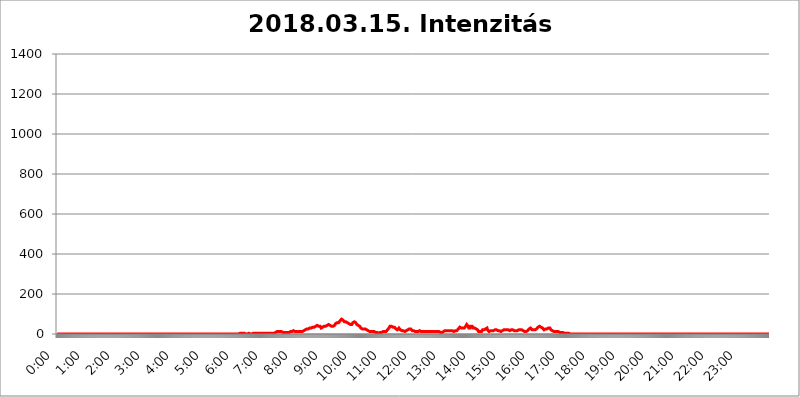
| Category | 2018.03.15. Intenzitás [W/m^2] |
|---|---|
| 0.0 | 0 |
| 0.0006944444444444445 | 0 |
| 0.001388888888888889 | 0 |
| 0.0020833333333333333 | 0 |
| 0.002777777777777778 | 0 |
| 0.003472222222222222 | 0 |
| 0.004166666666666667 | 0 |
| 0.004861111111111111 | 0 |
| 0.005555555555555556 | 0 |
| 0.0062499999999999995 | 0 |
| 0.006944444444444444 | 0 |
| 0.007638888888888889 | 0 |
| 0.008333333333333333 | 0 |
| 0.009027777777777779 | 0 |
| 0.009722222222222222 | 0 |
| 0.010416666666666666 | 0 |
| 0.011111111111111112 | 0 |
| 0.011805555555555555 | 0 |
| 0.012499999999999999 | 0 |
| 0.013194444444444444 | 0 |
| 0.013888888888888888 | 0 |
| 0.014583333333333332 | 0 |
| 0.015277777777777777 | 0 |
| 0.015972222222222224 | 0 |
| 0.016666666666666666 | 0 |
| 0.017361111111111112 | 0 |
| 0.018055555555555557 | 0 |
| 0.01875 | 0 |
| 0.019444444444444445 | 0 |
| 0.02013888888888889 | 0 |
| 0.020833333333333332 | 0 |
| 0.02152777777777778 | 0 |
| 0.022222222222222223 | 0 |
| 0.02291666666666667 | 0 |
| 0.02361111111111111 | 0 |
| 0.024305555555555556 | 0 |
| 0.024999999999999998 | 0 |
| 0.025694444444444447 | 0 |
| 0.02638888888888889 | 0 |
| 0.027083333333333334 | 0 |
| 0.027777777777777776 | 0 |
| 0.02847222222222222 | 0 |
| 0.029166666666666664 | 0 |
| 0.029861111111111113 | 0 |
| 0.030555555555555555 | 0 |
| 0.03125 | 0 |
| 0.03194444444444445 | 0 |
| 0.03263888888888889 | 0 |
| 0.03333333333333333 | 0 |
| 0.034027777777777775 | 0 |
| 0.034722222222222224 | 0 |
| 0.035416666666666666 | 0 |
| 0.036111111111111115 | 0 |
| 0.03680555555555556 | 0 |
| 0.0375 | 0 |
| 0.03819444444444444 | 0 |
| 0.03888888888888889 | 0 |
| 0.03958333333333333 | 0 |
| 0.04027777777777778 | 0 |
| 0.04097222222222222 | 0 |
| 0.041666666666666664 | 0 |
| 0.042361111111111106 | 0 |
| 0.04305555555555556 | 0 |
| 0.043750000000000004 | 0 |
| 0.044444444444444446 | 0 |
| 0.04513888888888889 | 0 |
| 0.04583333333333334 | 0 |
| 0.04652777777777778 | 0 |
| 0.04722222222222222 | 0 |
| 0.04791666666666666 | 0 |
| 0.04861111111111111 | 0 |
| 0.049305555555555554 | 0 |
| 0.049999999999999996 | 0 |
| 0.05069444444444445 | 0 |
| 0.051388888888888894 | 0 |
| 0.052083333333333336 | 0 |
| 0.05277777777777778 | 0 |
| 0.05347222222222222 | 0 |
| 0.05416666666666667 | 0 |
| 0.05486111111111111 | 0 |
| 0.05555555555555555 | 0 |
| 0.05625 | 0 |
| 0.05694444444444444 | 0 |
| 0.057638888888888885 | 0 |
| 0.05833333333333333 | 0 |
| 0.05902777777777778 | 0 |
| 0.059722222222222225 | 0 |
| 0.06041666666666667 | 0 |
| 0.061111111111111116 | 0 |
| 0.06180555555555556 | 0 |
| 0.0625 | 0 |
| 0.06319444444444444 | 0 |
| 0.06388888888888888 | 0 |
| 0.06458333333333334 | 0 |
| 0.06527777777777778 | 0 |
| 0.06597222222222222 | 0 |
| 0.06666666666666667 | 0 |
| 0.06736111111111111 | 0 |
| 0.06805555555555555 | 0 |
| 0.06874999999999999 | 0 |
| 0.06944444444444443 | 0 |
| 0.07013888888888889 | 0 |
| 0.07083333333333333 | 0 |
| 0.07152777777777779 | 0 |
| 0.07222222222222223 | 0 |
| 0.07291666666666667 | 0 |
| 0.07361111111111111 | 0 |
| 0.07430555555555556 | 0 |
| 0.075 | 0 |
| 0.07569444444444444 | 0 |
| 0.0763888888888889 | 0 |
| 0.07708333333333334 | 0 |
| 0.07777777777777778 | 0 |
| 0.07847222222222222 | 0 |
| 0.07916666666666666 | 0 |
| 0.0798611111111111 | 0 |
| 0.08055555555555556 | 0 |
| 0.08125 | 0 |
| 0.08194444444444444 | 0 |
| 0.08263888888888889 | 0 |
| 0.08333333333333333 | 0 |
| 0.08402777777777777 | 0 |
| 0.08472222222222221 | 0 |
| 0.08541666666666665 | 0 |
| 0.08611111111111112 | 0 |
| 0.08680555555555557 | 0 |
| 0.08750000000000001 | 0 |
| 0.08819444444444445 | 0 |
| 0.08888888888888889 | 0 |
| 0.08958333333333333 | 0 |
| 0.09027777777777778 | 0 |
| 0.09097222222222222 | 0 |
| 0.09166666666666667 | 0 |
| 0.09236111111111112 | 0 |
| 0.09305555555555556 | 0 |
| 0.09375 | 0 |
| 0.09444444444444444 | 0 |
| 0.09513888888888888 | 0 |
| 0.09583333333333333 | 0 |
| 0.09652777777777777 | 0 |
| 0.09722222222222222 | 0 |
| 0.09791666666666667 | 0 |
| 0.09861111111111111 | 0 |
| 0.09930555555555555 | 0 |
| 0.09999999999999999 | 0 |
| 0.10069444444444443 | 0 |
| 0.1013888888888889 | 0 |
| 0.10208333333333335 | 0 |
| 0.10277777777777779 | 0 |
| 0.10347222222222223 | 0 |
| 0.10416666666666667 | 0 |
| 0.10486111111111111 | 0 |
| 0.10555555555555556 | 0 |
| 0.10625 | 0 |
| 0.10694444444444444 | 0 |
| 0.1076388888888889 | 0 |
| 0.10833333333333334 | 0 |
| 0.10902777777777778 | 0 |
| 0.10972222222222222 | 0 |
| 0.1111111111111111 | 0 |
| 0.11180555555555556 | 0 |
| 0.11180555555555556 | 0 |
| 0.1125 | 0 |
| 0.11319444444444444 | 0 |
| 0.11388888888888889 | 0 |
| 0.11458333333333333 | 0 |
| 0.11527777777777777 | 0 |
| 0.11597222222222221 | 0 |
| 0.11666666666666665 | 0 |
| 0.1173611111111111 | 0 |
| 0.11805555555555557 | 0 |
| 0.11944444444444445 | 0 |
| 0.12013888888888889 | 0 |
| 0.12083333333333333 | 0 |
| 0.12152777777777778 | 0 |
| 0.12222222222222223 | 0 |
| 0.12291666666666667 | 0 |
| 0.12291666666666667 | 0 |
| 0.12361111111111112 | 0 |
| 0.12430555555555556 | 0 |
| 0.125 | 0 |
| 0.12569444444444444 | 0 |
| 0.12638888888888888 | 0 |
| 0.12708333333333333 | 0 |
| 0.16875 | 0 |
| 0.12847222222222224 | 0 |
| 0.12916666666666668 | 0 |
| 0.12986111111111112 | 0 |
| 0.13055555555555556 | 0 |
| 0.13125 | 0 |
| 0.13194444444444445 | 0 |
| 0.1326388888888889 | 0 |
| 0.13333333333333333 | 0 |
| 0.13402777777777777 | 0 |
| 0.13402777777777777 | 0 |
| 0.13472222222222222 | 0 |
| 0.13541666666666666 | 0 |
| 0.1361111111111111 | 0 |
| 0.13749999999999998 | 0 |
| 0.13819444444444443 | 0 |
| 0.1388888888888889 | 0 |
| 0.13958333333333334 | 0 |
| 0.14027777777777778 | 0 |
| 0.14097222222222222 | 0 |
| 0.14166666666666666 | 0 |
| 0.1423611111111111 | 0 |
| 0.14305555555555557 | 0 |
| 0.14375000000000002 | 0 |
| 0.14444444444444446 | 0 |
| 0.1451388888888889 | 0 |
| 0.1451388888888889 | 0 |
| 0.14652777777777778 | 0 |
| 0.14722222222222223 | 0 |
| 0.14791666666666667 | 0 |
| 0.1486111111111111 | 0 |
| 0.14930555555555555 | 0 |
| 0.15 | 0 |
| 0.15069444444444444 | 0 |
| 0.15138888888888888 | 0 |
| 0.15208333333333332 | 0 |
| 0.15277777777777776 | 0 |
| 0.15347222222222223 | 0 |
| 0.15416666666666667 | 0 |
| 0.15486111111111112 | 0 |
| 0.15555555555555556 | 0 |
| 0.15625 | 0 |
| 0.15694444444444444 | 0 |
| 0.15763888888888888 | 0 |
| 0.15833333333333333 | 0 |
| 0.15902777777777777 | 0 |
| 0.15972222222222224 | 0 |
| 0.16041666666666668 | 0 |
| 0.16111111111111112 | 0 |
| 0.16180555555555556 | 0 |
| 0.1625 | 0 |
| 0.16319444444444445 | 0 |
| 0.1638888888888889 | 0 |
| 0.16458333333333333 | 0 |
| 0.16527777777777777 | 0 |
| 0.16597222222222222 | 0 |
| 0.16666666666666666 | 0 |
| 0.1673611111111111 | 0 |
| 0.16805555555555554 | 0 |
| 0.16874999999999998 | 0 |
| 0.16944444444444443 | 0 |
| 0.17013888888888887 | 0 |
| 0.1708333333333333 | 0 |
| 0.17152777777777775 | 0 |
| 0.17222222222222225 | 0 |
| 0.1729166666666667 | 0 |
| 0.17361111111111113 | 0 |
| 0.17430555555555557 | 0 |
| 0.17500000000000002 | 0 |
| 0.17569444444444446 | 0 |
| 0.1763888888888889 | 0 |
| 0.17708333333333334 | 0 |
| 0.17777777777777778 | 0 |
| 0.17847222222222223 | 0 |
| 0.17916666666666667 | 0 |
| 0.1798611111111111 | 0 |
| 0.18055555555555555 | 0 |
| 0.18125 | 0 |
| 0.18194444444444444 | 0 |
| 0.1826388888888889 | 0 |
| 0.18333333333333335 | 0 |
| 0.1840277777777778 | 0 |
| 0.18472222222222223 | 0 |
| 0.18541666666666667 | 0 |
| 0.18611111111111112 | 0 |
| 0.18680555555555556 | 0 |
| 0.1875 | 0 |
| 0.18819444444444444 | 0 |
| 0.18888888888888888 | 0 |
| 0.18958333333333333 | 0 |
| 0.19027777777777777 | 0 |
| 0.1909722222222222 | 0 |
| 0.19166666666666665 | 0 |
| 0.19236111111111112 | 0 |
| 0.19305555555555554 | 0 |
| 0.19375 | 0 |
| 0.19444444444444445 | 0 |
| 0.1951388888888889 | 0 |
| 0.19583333333333333 | 0 |
| 0.19652777777777777 | 0 |
| 0.19722222222222222 | 0 |
| 0.19791666666666666 | 0 |
| 0.1986111111111111 | 0 |
| 0.19930555555555554 | 0 |
| 0.19999999999999998 | 0 |
| 0.20069444444444443 | 0 |
| 0.20138888888888887 | 0 |
| 0.2020833333333333 | 0 |
| 0.2027777777777778 | 0 |
| 0.2034722222222222 | 0 |
| 0.2041666666666667 | 0 |
| 0.20486111111111113 | 0 |
| 0.20555555555555557 | 0 |
| 0.20625000000000002 | 0 |
| 0.20694444444444446 | 0 |
| 0.2076388888888889 | 0 |
| 0.20833333333333334 | 0 |
| 0.20902777777777778 | 0 |
| 0.20972222222222223 | 0 |
| 0.21041666666666667 | 0 |
| 0.2111111111111111 | 0 |
| 0.21180555555555555 | 0 |
| 0.2125 | 0 |
| 0.21319444444444444 | 0 |
| 0.2138888888888889 | 0 |
| 0.21458333333333335 | 0 |
| 0.2152777777777778 | 0 |
| 0.21597222222222223 | 0 |
| 0.21666666666666667 | 0 |
| 0.21736111111111112 | 0 |
| 0.21805555555555556 | 0 |
| 0.21875 | 0 |
| 0.21944444444444444 | 0 |
| 0.22013888888888888 | 0 |
| 0.22083333333333333 | 0 |
| 0.22152777777777777 | 0 |
| 0.2222222222222222 | 0 |
| 0.22291666666666665 | 0 |
| 0.2236111111111111 | 0 |
| 0.22430555555555556 | 0 |
| 0.225 | 0 |
| 0.22569444444444445 | 0 |
| 0.2263888888888889 | 0 |
| 0.22708333333333333 | 0 |
| 0.22777777777777777 | 0 |
| 0.22847222222222222 | 0 |
| 0.22916666666666666 | 0 |
| 0.2298611111111111 | 0 |
| 0.23055555555555554 | 0 |
| 0.23124999999999998 | 0 |
| 0.23194444444444443 | 0 |
| 0.23263888888888887 | 0 |
| 0.2333333333333333 | 0 |
| 0.2340277777777778 | 0 |
| 0.2347222222222222 | 0 |
| 0.2354166666666667 | 0 |
| 0.23611111111111113 | 0 |
| 0.23680555555555557 | 0 |
| 0.23750000000000002 | 0 |
| 0.23819444444444446 | 0 |
| 0.2388888888888889 | 0 |
| 0.23958333333333334 | 0 |
| 0.24027777777777778 | 0 |
| 0.24097222222222223 | 0 |
| 0.24166666666666667 | 0 |
| 0.2423611111111111 | 0 |
| 0.24305555555555555 | 0 |
| 0.24375 | 0 |
| 0.24444444444444446 | 0 |
| 0.24513888888888888 | 0 |
| 0.24583333333333335 | 0 |
| 0.2465277777777778 | 0 |
| 0.24722222222222223 | 0 |
| 0.24791666666666667 | 0 |
| 0.24861111111111112 | 0 |
| 0.24930555555555556 | 0 |
| 0.25 | 0 |
| 0.25069444444444444 | 0 |
| 0.2513888888888889 | 0 |
| 0.2520833333333333 | 0 |
| 0.25277777777777777 | 0 |
| 0.2534722222222222 | 0 |
| 0.25416666666666665 | 0 |
| 0.2548611111111111 | 0 |
| 0.2555555555555556 | 0 |
| 0.25625000000000003 | 3.525 |
| 0.2569444444444445 | 3.525 |
| 0.2576388888888889 | 3.525 |
| 0.25833333333333336 | 3.525 |
| 0.2590277777777778 | 3.525 |
| 0.25972222222222224 | 3.525 |
| 0.2604166666666667 | 3.525 |
| 0.2611111111111111 | 3.525 |
| 0.26180555555555557 | 3.525 |
| 0.2625 | 3.525 |
| 0.26319444444444445 | 3.525 |
| 0.2638888888888889 | 3.525 |
| 0.26458333333333334 | 0 |
| 0.2652777777777778 | 0 |
| 0.2659722222222222 | 0 |
| 0.26666666666666666 | 0 |
| 0.2673611111111111 | 0 |
| 0.26805555555555555 | 0 |
| 0.26875 | 3.525 |
| 0.26944444444444443 | 0 |
| 0.2701388888888889 | 3.525 |
| 0.2708333333333333 | 0 |
| 0.27152777777777776 | 3.525 |
| 0.2722222222222222 | 3.525 |
| 0.27291666666666664 | 0 |
| 0.2736111111111111 | 0 |
| 0.2743055555555555 | 3.525 |
| 0.27499999999999997 | 3.525 |
| 0.27569444444444446 | 0 |
| 0.27638888888888885 | 0 |
| 0.27708333333333335 | 3.525 |
| 0.2777777777777778 | 0 |
| 0.27847222222222223 | 3.525 |
| 0.2791666666666667 | 3.525 |
| 0.2798611111111111 | 3.525 |
| 0.28055555555555556 | 3.525 |
| 0.28125 | 3.525 |
| 0.28194444444444444 | 3.525 |
| 0.2826388888888889 | 3.525 |
| 0.2833333333333333 | 3.525 |
| 0.28402777777777777 | 3.525 |
| 0.2847222222222222 | 3.525 |
| 0.28541666666666665 | 3.525 |
| 0.28611111111111115 | 3.525 |
| 0.28680555555555554 | 0 |
| 0.28750000000000003 | 3.525 |
| 0.2881944444444445 | 3.525 |
| 0.2888888888888889 | 3.525 |
| 0.28958333333333336 | 3.525 |
| 0.2902777777777778 | 3.525 |
| 0.29097222222222224 | 3.525 |
| 0.2916666666666667 | 3.525 |
| 0.2923611111111111 | 3.525 |
| 0.29305555555555557 | 3.525 |
| 0.29375 | 3.525 |
| 0.29444444444444445 | 3.525 |
| 0.2951388888888889 | 3.525 |
| 0.29583333333333334 | 3.525 |
| 0.2965277777777778 | 3.525 |
| 0.2972222222222222 | 3.525 |
| 0.29791666666666666 | 3.525 |
| 0.2986111111111111 | 3.525 |
| 0.29930555555555555 | 3.525 |
| 0.3 | 3.525 |
| 0.30069444444444443 | 3.525 |
| 0.3013888888888889 | 3.525 |
| 0.3020833333333333 | 3.525 |
| 0.30277777777777776 | 3.525 |
| 0.3034722222222222 | 3.525 |
| 0.30416666666666664 | 3.525 |
| 0.3048611111111111 | 7.887 |
| 0.3055555555555555 | 7.887 |
| 0.30624999999999997 | 7.887 |
| 0.3069444444444444 | 7.887 |
| 0.3076388888888889 | 7.887 |
| 0.30833333333333335 | 12.257 |
| 0.3090277777777778 | 12.257 |
| 0.30972222222222223 | 12.257 |
| 0.3104166666666667 | 12.257 |
| 0.3111111111111111 | 12.257 |
| 0.31180555555555556 | 12.257 |
| 0.3125 | 12.257 |
| 0.31319444444444444 | 12.257 |
| 0.3138888888888889 | 12.257 |
| 0.3145833333333333 | 12.257 |
| 0.31527777777777777 | 12.257 |
| 0.3159722222222222 | 7.887 |
| 0.31666666666666665 | 7.887 |
| 0.31736111111111115 | 7.887 |
| 0.31805555555555554 | 7.887 |
| 0.31875000000000003 | 7.887 |
| 0.3194444444444445 | 7.887 |
| 0.3201388888888889 | 7.887 |
| 0.32083333333333336 | 7.887 |
| 0.3215277777777778 | 7.887 |
| 0.32222222222222224 | 7.887 |
| 0.3229166666666667 | 7.887 |
| 0.3236111111111111 | 7.887 |
| 0.32430555555555557 | 7.887 |
| 0.325 | 7.887 |
| 0.32569444444444445 | 7.887 |
| 0.3263888888888889 | 7.887 |
| 0.32708333333333334 | 12.257 |
| 0.3277777777777778 | 12.257 |
| 0.3284722222222222 | 12.257 |
| 0.32916666666666666 | 12.257 |
| 0.3298611111111111 | 12.257 |
| 0.33055555555555555 | 12.257 |
| 0.33125 | 16.636 |
| 0.33194444444444443 | 16.636 |
| 0.3326388888888889 | 12.257 |
| 0.3333333333333333 | 12.257 |
| 0.3340277777777778 | 12.257 |
| 0.3347222222222222 | 12.257 |
| 0.3354166666666667 | 12.257 |
| 0.3361111111111111 | 12.257 |
| 0.3368055555555556 | 12.257 |
| 0.33749999999999997 | 12.257 |
| 0.33819444444444446 | 12.257 |
| 0.33888888888888885 | 12.257 |
| 0.33958333333333335 | 12.257 |
| 0.34027777777777773 | 12.257 |
| 0.34097222222222223 | 12.257 |
| 0.3416666666666666 | 12.257 |
| 0.3423611111111111 | 12.257 |
| 0.3430555555555555 | 12.257 |
| 0.34375 | 12.257 |
| 0.3444444444444445 | 12.257 |
| 0.3451388888888889 | 12.257 |
| 0.3458333333333334 | 16.636 |
| 0.34652777777777777 | 16.636 |
| 0.34722222222222227 | 21.024 |
| 0.34791666666666665 | 21.024 |
| 0.34861111111111115 | 25.419 |
| 0.34930555555555554 | 25.419 |
| 0.35000000000000003 | 25.419 |
| 0.3506944444444444 | 25.419 |
| 0.3513888888888889 | 25.419 |
| 0.3520833333333333 | 25.419 |
| 0.3527777777777778 | 25.419 |
| 0.3534722222222222 | 29.823 |
| 0.3541666666666667 | 29.823 |
| 0.3548611111111111 | 29.823 |
| 0.35555555555555557 | 29.823 |
| 0.35625 | 29.823 |
| 0.35694444444444445 | 34.234 |
| 0.3576388888888889 | 34.234 |
| 0.35833333333333334 | 34.234 |
| 0.3590277777777778 | 34.234 |
| 0.3597222222222222 | 34.234 |
| 0.36041666666666666 | 34.234 |
| 0.3611111111111111 | 34.234 |
| 0.36180555555555555 | 34.234 |
| 0.3625 | 38.653 |
| 0.36319444444444443 | 38.653 |
| 0.3638888888888889 | 38.653 |
| 0.3645833333333333 | 43.079 |
| 0.3652777777777778 | 38.653 |
| 0.3659722222222222 | 38.653 |
| 0.3666666666666667 | 38.653 |
| 0.3673611111111111 | 38.653 |
| 0.3680555555555556 | 38.653 |
| 0.36874999999999997 | 38.653 |
| 0.36944444444444446 | 34.234 |
| 0.37013888888888885 | 29.823 |
| 0.37083333333333335 | 34.234 |
| 0.37152777777777773 | 34.234 |
| 0.37222222222222223 | 34.234 |
| 0.3729166666666666 | 34.234 |
| 0.3736111111111111 | 34.234 |
| 0.3743055555555555 | 38.653 |
| 0.375 | 38.653 |
| 0.3756944444444445 | 38.653 |
| 0.3763888888888889 | 38.653 |
| 0.3770833333333334 | 43.079 |
| 0.37777777777777777 | 43.079 |
| 0.37847222222222227 | 43.079 |
| 0.37916666666666665 | 47.511 |
| 0.37986111111111115 | 47.511 |
| 0.38055555555555554 | 47.511 |
| 0.38125000000000003 | 43.079 |
| 0.3819444444444444 | 43.079 |
| 0.3826388888888889 | 43.079 |
| 0.3833333333333333 | 43.079 |
| 0.3840277777777778 | 38.653 |
| 0.3847222222222222 | 38.653 |
| 0.3854166666666667 | 38.653 |
| 0.3861111111111111 | 38.653 |
| 0.38680555555555557 | 38.653 |
| 0.3875 | 38.653 |
| 0.38819444444444445 | 43.079 |
| 0.3888888888888889 | 43.079 |
| 0.38958333333333334 | 47.511 |
| 0.3902777777777778 | 51.951 |
| 0.3909722222222222 | 51.951 |
| 0.39166666666666666 | 56.398 |
| 0.3923611111111111 | 56.398 |
| 0.39305555555555555 | 56.398 |
| 0.39375 | 51.951 |
| 0.39444444444444443 | 56.398 |
| 0.3951388888888889 | 56.398 |
| 0.3958333333333333 | 60.85 |
| 0.3965277777777778 | 65.31 |
| 0.3972222222222222 | 69.775 |
| 0.3979166666666667 | 69.775 |
| 0.3986111111111111 | 74.246 |
| 0.3993055555555556 | 69.775 |
| 0.39999999999999997 | 69.775 |
| 0.40069444444444446 | 69.775 |
| 0.40138888888888885 | 65.31 |
| 0.40208333333333335 | 65.31 |
| 0.40277777777777773 | 60.85 |
| 0.40347222222222223 | 60.85 |
| 0.4041666666666666 | 60.85 |
| 0.4048611111111111 | 60.85 |
| 0.4055555555555555 | 60.85 |
| 0.40625 | 56.398 |
| 0.4069444444444445 | 56.398 |
| 0.4076388888888889 | 56.398 |
| 0.4083333333333334 | 51.951 |
| 0.40902777777777777 | 51.951 |
| 0.40972222222222227 | 47.511 |
| 0.41041666666666665 | 47.511 |
| 0.41111111111111115 | 47.511 |
| 0.41180555555555554 | 47.511 |
| 0.41250000000000003 | 47.511 |
| 0.4131944444444444 | 47.511 |
| 0.4138888888888889 | 51.951 |
| 0.4145833333333333 | 56.398 |
| 0.4152777777777778 | 56.398 |
| 0.4159722222222222 | 56.398 |
| 0.4166666666666667 | 60.85 |
| 0.4173611111111111 | 65.31 |
| 0.41805555555555557 | 60.85 |
| 0.41875 | 56.398 |
| 0.41944444444444445 | 51.951 |
| 0.4201388888888889 | 47.511 |
| 0.42083333333333334 | 47.511 |
| 0.4215277777777778 | 43.079 |
| 0.4222222222222222 | 43.079 |
| 0.42291666666666666 | 43.079 |
| 0.4236111111111111 | 38.653 |
| 0.42430555555555555 | 38.653 |
| 0.425 | 34.234 |
| 0.42569444444444443 | 29.823 |
| 0.4263888888888889 | 29.823 |
| 0.4270833333333333 | 25.419 |
| 0.4277777777777778 | 25.419 |
| 0.4284722222222222 | 25.419 |
| 0.4291666666666667 | 25.419 |
| 0.4298611111111111 | 25.419 |
| 0.4305555555555556 | 25.419 |
| 0.43124999999999997 | 25.419 |
| 0.43194444444444446 | 25.419 |
| 0.43263888888888885 | 25.419 |
| 0.43333333333333335 | 25.419 |
| 0.43402777777777773 | 21.024 |
| 0.43472222222222223 | 21.024 |
| 0.4354166666666666 | 16.636 |
| 0.4361111111111111 | 16.636 |
| 0.4368055555555555 | 12.257 |
| 0.4375 | 12.257 |
| 0.4381944444444445 | 12.257 |
| 0.4388888888888889 | 12.257 |
| 0.4395833333333334 | 12.257 |
| 0.44027777777777777 | 12.257 |
| 0.44097222222222227 | 12.257 |
| 0.44166666666666665 | 12.257 |
| 0.44236111111111115 | 12.257 |
| 0.44305555555555554 | 12.257 |
| 0.44375000000000003 | 12.257 |
| 0.4444444444444444 | 12.257 |
| 0.4451388888888889 | 12.257 |
| 0.4458333333333333 | 12.257 |
| 0.4465277777777778 | 7.887 |
| 0.4472222222222222 | 7.887 |
| 0.4479166666666667 | 7.887 |
| 0.4486111111111111 | 7.887 |
| 0.44930555555555557 | 7.887 |
| 0.45 | 7.887 |
| 0.45069444444444445 | 3.525 |
| 0.4513888888888889 | 7.887 |
| 0.45208333333333334 | 7.887 |
| 0.4527777777777778 | 7.887 |
| 0.4534722222222222 | 7.887 |
| 0.45416666666666666 | 7.887 |
| 0.4548611111111111 | 7.887 |
| 0.45555555555555555 | 7.887 |
| 0.45625 | 12.257 |
| 0.45694444444444443 | 12.257 |
| 0.4576388888888889 | 12.257 |
| 0.4583333333333333 | 12.257 |
| 0.4590277777777778 | 12.257 |
| 0.4597222222222222 | 12.257 |
| 0.4604166666666667 | 12.257 |
| 0.4611111111111111 | 12.257 |
| 0.4618055555555556 | 12.257 |
| 0.46249999999999997 | 16.636 |
| 0.46319444444444446 | 21.024 |
| 0.46388888888888885 | 21.024 |
| 0.46458333333333335 | 25.419 |
| 0.46527777777777773 | 29.823 |
| 0.46597222222222223 | 34.234 |
| 0.4666666666666666 | 38.653 |
| 0.4673611111111111 | 43.079 |
| 0.4680555555555555 | 43.079 |
| 0.46875 | 38.653 |
| 0.4694444444444445 | 34.234 |
| 0.4701388888888889 | 34.234 |
| 0.4708333333333334 | 34.234 |
| 0.47152777777777777 | 34.234 |
| 0.47222222222222227 | 34.234 |
| 0.47291666666666665 | 34.234 |
| 0.47361111111111115 | 34.234 |
| 0.47430555555555554 | 29.823 |
| 0.47500000000000003 | 25.419 |
| 0.4756944444444444 | 21.024 |
| 0.4763888888888889 | 21.024 |
| 0.4770833333333333 | 21.024 |
| 0.4777777777777778 | 21.024 |
| 0.4784722222222222 | 25.419 |
| 0.4791666666666667 | 29.823 |
| 0.4798611111111111 | 29.823 |
| 0.48055555555555557 | 25.419 |
| 0.48125 | 21.024 |
| 0.48194444444444445 | 21.024 |
| 0.4826388888888889 | 21.024 |
| 0.48333333333333334 | 16.636 |
| 0.4840277777777778 | 16.636 |
| 0.4847222222222222 | 16.636 |
| 0.48541666666666666 | 16.636 |
| 0.4861111111111111 | 12.257 |
| 0.48680555555555555 | 12.257 |
| 0.4875 | 12.257 |
| 0.48819444444444443 | 12.257 |
| 0.4888888888888889 | 12.257 |
| 0.4895833333333333 | 16.636 |
| 0.4902777777777778 | 16.636 |
| 0.4909722222222222 | 16.636 |
| 0.4916666666666667 | 21.024 |
| 0.4923611111111111 | 25.419 |
| 0.4930555555555556 | 25.419 |
| 0.49374999999999997 | 25.419 |
| 0.49444444444444446 | 25.419 |
| 0.49513888888888885 | 25.419 |
| 0.49583333333333335 | 25.419 |
| 0.49652777777777773 | 21.024 |
| 0.49722222222222223 | 21.024 |
| 0.4979166666666666 | 16.636 |
| 0.4986111111111111 | 16.636 |
| 0.4993055555555555 | 16.636 |
| 0.5 | 16.636 |
| 0.5006944444444444 | 12.257 |
| 0.5013888888888889 | 12.257 |
| 0.5020833333333333 | 12.257 |
| 0.5027777777777778 | 12.257 |
| 0.5034722222222222 | 12.257 |
| 0.5041666666666667 | 12.257 |
| 0.5048611111111111 | 12.257 |
| 0.5055555555555555 | 12.257 |
| 0.50625 | 12.257 |
| 0.5069444444444444 | 12.257 |
| 0.5076388888888889 | 12.257 |
| 0.5083333333333333 | 16.636 |
| 0.5090277777777777 | 12.257 |
| 0.5097222222222222 | 12.257 |
| 0.5104166666666666 | 12.257 |
| 0.5111111111111112 | 12.257 |
| 0.5118055555555555 | 12.257 |
| 0.5125000000000001 | 12.257 |
| 0.5131944444444444 | 12.257 |
| 0.513888888888889 | 12.257 |
| 0.5145833333333333 | 12.257 |
| 0.5152777777777778 | 12.257 |
| 0.5159722222222222 | 7.887 |
| 0.5166666666666667 | 12.257 |
| 0.517361111111111 | 12.257 |
| 0.5180555555555556 | 12.257 |
| 0.5187499999999999 | 12.257 |
| 0.5194444444444445 | 12.257 |
| 0.5201388888888888 | 12.257 |
| 0.5208333333333334 | 12.257 |
| 0.5215277777777778 | 12.257 |
| 0.5222222222222223 | 12.257 |
| 0.5229166666666667 | 12.257 |
| 0.5236111111111111 | 12.257 |
| 0.5243055555555556 | 7.887 |
| 0.525 | 12.257 |
| 0.5256944444444445 | 12.257 |
| 0.5263888888888889 | 12.257 |
| 0.5270833333333333 | 12.257 |
| 0.5277777777777778 | 12.257 |
| 0.5284722222222222 | 12.257 |
| 0.5291666666666667 | 12.257 |
| 0.5298611111111111 | 12.257 |
| 0.5305555555555556 | 12.257 |
| 0.53125 | 12.257 |
| 0.5319444444444444 | 12.257 |
| 0.5326388888888889 | 12.257 |
| 0.5333333333333333 | 12.257 |
| 0.5340277777777778 | 12.257 |
| 0.5347222222222222 | 12.257 |
| 0.5354166666666667 | 12.257 |
| 0.5361111111111111 | 12.257 |
| 0.5368055555555555 | 12.257 |
| 0.5375 | 7.887 |
| 0.5381944444444444 | 7.887 |
| 0.5388888888888889 | 7.887 |
| 0.5395833333333333 | 7.887 |
| 0.5402777777777777 | 7.887 |
| 0.5409722222222222 | 12.257 |
| 0.5416666666666666 | 12.257 |
| 0.5423611111111112 | 12.257 |
| 0.5430555555555555 | 12.257 |
| 0.5437500000000001 | 16.636 |
| 0.5444444444444444 | 16.636 |
| 0.545138888888889 | 16.636 |
| 0.5458333333333333 | 16.636 |
| 0.5465277777777778 | 16.636 |
| 0.5472222222222222 | 16.636 |
| 0.5479166666666667 | 16.636 |
| 0.548611111111111 | 16.636 |
| 0.5493055555555556 | 16.636 |
| 0.5499999999999999 | 16.636 |
| 0.5506944444444445 | 16.636 |
| 0.5513888888888888 | 16.636 |
| 0.5520833333333334 | 16.636 |
| 0.5527777777777778 | 16.636 |
| 0.5534722222222223 | 16.636 |
| 0.5541666666666667 | 16.636 |
| 0.5548611111111111 | 16.636 |
| 0.5555555555555556 | 16.636 |
| 0.55625 | 12.257 |
| 0.5569444444444445 | 12.257 |
| 0.5576388888888889 | 16.636 |
| 0.5583333333333333 | 16.636 |
| 0.5590277777777778 | 16.636 |
| 0.5597222222222222 | 16.636 |
| 0.5604166666666667 | 16.636 |
| 0.5611111111111111 | 16.636 |
| 0.5618055555555556 | 21.024 |
| 0.5625 | 25.419 |
| 0.5631944444444444 | 29.823 |
| 0.5638888888888889 | 29.823 |
| 0.5645833333333333 | 34.234 |
| 0.5652777777777778 | 29.823 |
| 0.5659722222222222 | 29.823 |
| 0.5666666666666667 | 29.823 |
| 0.5673611111111111 | 29.823 |
| 0.5680555555555555 | 25.419 |
| 0.56875 | 29.823 |
| 0.5694444444444444 | 29.823 |
| 0.5701388888888889 | 29.823 |
| 0.5708333333333333 | 29.823 |
| 0.5715277777777777 | 29.823 |
| 0.5722222222222222 | 34.234 |
| 0.5729166666666666 | 38.653 |
| 0.5736111111111112 | 43.079 |
| 0.5743055555555555 | 47.511 |
| 0.5750000000000001 | 47.511 |
| 0.5756944444444444 | 43.079 |
| 0.576388888888889 | 38.653 |
| 0.5770833333333333 | 29.823 |
| 0.5777777777777778 | 25.419 |
| 0.5784722222222222 | 29.823 |
| 0.5791666666666667 | 29.823 |
| 0.579861111111111 | 38.653 |
| 0.5805555555555556 | 38.653 |
| 0.5812499999999999 | 43.079 |
| 0.5819444444444445 | 38.653 |
| 0.5826388888888888 | 34.234 |
| 0.5833333333333334 | 29.823 |
| 0.5840277777777778 | 34.234 |
| 0.5847222222222223 | 29.823 |
| 0.5854166666666667 | 29.823 |
| 0.5861111111111111 | 29.823 |
| 0.5868055555555556 | 25.419 |
| 0.5875 | 25.419 |
| 0.5881944444444445 | 25.419 |
| 0.5888888888888889 | 21.024 |
| 0.5895833333333333 | 21.024 |
| 0.5902777777777778 | 16.636 |
| 0.5909722222222222 | 12.257 |
| 0.5916666666666667 | 12.257 |
| 0.5923611111111111 | 12.257 |
| 0.5930555555555556 | 12.257 |
| 0.59375 | 12.257 |
| 0.5944444444444444 | 12.257 |
| 0.5951388888888889 | 12.257 |
| 0.5958333333333333 | 16.636 |
| 0.5965277777777778 | 21.024 |
| 0.5972222222222222 | 21.024 |
| 0.5979166666666667 | 21.024 |
| 0.5986111111111111 | 21.024 |
| 0.5993055555555555 | 21.024 |
| 0.6 | 21.024 |
| 0.6006944444444444 | 25.419 |
| 0.6013888888888889 | 29.823 |
| 0.6020833333333333 | 29.823 |
| 0.6027777777777777 | 29.823 |
| 0.6034722222222222 | 21.024 |
| 0.6041666666666666 | 21.024 |
| 0.6048611111111112 | 16.636 |
| 0.6055555555555555 | 12.257 |
| 0.6062500000000001 | 12.257 |
| 0.6069444444444444 | 12.257 |
| 0.607638888888889 | 16.636 |
| 0.6083333333333333 | 16.636 |
| 0.6090277777777778 | 16.636 |
| 0.6097222222222222 | 16.636 |
| 0.6104166666666667 | 16.636 |
| 0.611111111111111 | 16.636 |
| 0.6118055555555556 | 16.636 |
| 0.6124999999999999 | 16.636 |
| 0.6131944444444445 | 21.024 |
| 0.6138888888888888 | 21.024 |
| 0.6145833333333334 | 25.419 |
| 0.6152777777777778 | 25.419 |
| 0.6159722222222223 | 21.024 |
| 0.6166666666666667 | 16.636 |
| 0.6173611111111111 | 16.636 |
| 0.6180555555555556 | 16.636 |
| 0.61875 | 16.636 |
| 0.6194444444444445 | 16.636 |
| 0.6201388888888889 | 16.636 |
| 0.6208333333333333 | 12.257 |
| 0.6215277777777778 | 12.257 |
| 0.6222222222222222 | 12.257 |
| 0.6229166666666667 | 12.257 |
| 0.6236111111111111 | 16.636 |
| 0.6243055555555556 | 16.636 |
| 0.625 | 16.636 |
| 0.6256944444444444 | 16.636 |
| 0.6263888888888889 | 21.024 |
| 0.6270833333333333 | 21.024 |
| 0.6277777777777778 | 21.024 |
| 0.6284722222222222 | 21.024 |
| 0.6291666666666667 | 21.024 |
| 0.6298611111111111 | 21.024 |
| 0.6305555555555555 | 21.024 |
| 0.63125 | 21.024 |
| 0.6319444444444444 | 21.024 |
| 0.6326388888888889 | 21.024 |
| 0.6333333333333333 | 21.024 |
| 0.6340277777777777 | 21.024 |
| 0.6347222222222222 | 16.636 |
| 0.6354166666666666 | 21.024 |
| 0.6361111111111112 | 21.024 |
| 0.6368055555555555 | 21.024 |
| 0.6375000000000001 | 21.024 |
| 0.6381944444444444 | 21.024 |
| 0.638888888888889 | 21.024 |
| 0.6395833333333333 | 16.636 |
| 0.6402777777777778 | 16.636 |
| 0.6409722222222222 | 16.636 |
| 0.6416666666666667 | 16.636 |
| 0.642361111111111 | 16.636 |
| 0.6430555555555556 | 16.636 |
| 0.6437499999999999 | 16.636 |
| 0.6444444444444445 | 16.636 |
| 0.6451388888888888 | 16.636 |
| 0.6458333333333334 | 21.024 |
| 0.6465277777777778 | 21.024 |
| 0.6472222222222223 | 21.024 |
| 0.6479166666666667 | 21.024 |
| 0.6486111111111111 | 21.024 |
| 0.6493055555555556 | 21.024 |
| 0.65 | 21.024 |
| 0.6506944444444445 | 21.024 |
| 0.6513888888888889 | 21.024 |
| 0.6520833333333333 | 21.024 |
| 0.6527777777777778 | 16.636 |
| 0.6534722222222222 | 16.636 |
| 0.6541666666666667 | 12.257 |
| 0.6548611111111111 | 12.257 |
| 0.6555555555555556 | 12.257 |
| 0.65625 | 12.257 |
| 0.6569444444444444 | 12.257 |
| 0.6576388888888889 | 12.257 |
| 0.6583333333333333 | 16.636 |
| 0.6590277777777778 | 16.636 |
| 0.6597222222222222 | 16.636 |
| 0.6604166666666667 | 21.024 |
| 0.6611111111111111 | 21.024 |
| 0.6618055555555555 | 25.419 |
| 0.6625 | 29.823 |
| 0.6631944444444444 | 29.823 |
| 0.6638888888888889 | 29.823 |
| 0.6645833333333333 | 29.823 |
| 0.6652777777777777 | 25.419 |
| 0.6659722222222222 | 21.024 |
| 0.6666666666666666 | 21.024 |
| 0.6673611111111111 | 21.024 |
| 0.6680555555555556 | 21.024 |
| 0.6687500000000001 | 21.024 |
| 0.6694444444444444 | 21.024 |
| 0.6701388888888888 | 21.024 |
| 0.6708333333333334 | 21.024 |
| 0.6715277777777778 | 21.024 |
| 0.6722222222222222 | 25.419 |
| 0.6729166666666666 | 29.823 |
| 0.6736111111111112 | 29.823 |
| 0.6743055555555556 | 34.234 |
| 0.6749999999999999 | 34.234 |
| 0.6756944444444444 | 38.653 |
| 0.6763888888888889 | 38.653 |
| 0.6770833333333334 | 38.653 |
| 0.6777777777777777 | 38.653 |
| 0.6784722222222223 | 34.234 |
| 0.6791666666666667 | 34.234 |
| 0.6798611111111111 | 29.823 |
| 0.6805555555555555 | 29.823 |
| 0.68125 | 25.419 |
| 0.6819444444444445 | 25.419 |
| 0.6826388888888889 | 21.024 |
| 0.6833333333333332 | 21.024 |
| 0.6840277777777778 | 21.024 |
| 0.6847222222222222 | 25.419 |
| 0.6854166666666667 | 21.024 |
| 0.686111111111111 | 21.024 |
| 0.6868055555555556 | 25.419 |
| 0.6875 | 25.419 |
| 0.6881944444444444 | 25.419 |
| 0.688888888888889 | 29.823 |
| 0.6895833333333333 | 29.823 |
| 0.6902777777777778 | 29.823 |
| 0.6909722222222222 | 29.823 |
| 0.6916666666666668 | 25.419 |
| 0.6923611111111111 | 21.024 |
| 0.6930555555555555 | 21.024 |
| 0.69375 | 21.024 |
| 0.6944444444444445 | 16.636 |
| 0.6951388888888889 | 16.636 |
| 0.6958333333333333 | 12.257 |
| 0.6965277777777777 | 12.257 |
| 0.6972222222222223 | 12.257 |
| 0.6979166666666666 | 12.257 |
| 0.6986111111111111 | 12.257 |
| 0.6993055555555556 | 16.636 |
| 0.7000000000000001 | 16.636 |
| 0.7006944444444444 | 12.257 |
| 0.7013888888888888 | 12.257 |
| 0.7020833333333334 | 12.257 |
| 0.7027777777777778 | 12.257 |
| 0.7034722222222222 | 12.257 |
| 0.7041666666666666 | 12.257 |
| 0.7048611111111112 | 7.887 |
| 0.7055555555555556 | 7.887 |
| 0.7062499999999999 | 7.887 |
| 0.7069444444444444 | 7.887 |
| 0.7076388888888889 | 7.887 |
| 0.7083333333333334 | 7.887 |
| 0.7090277777777777 | 7.887 |
| 0.7097222222222223 | 7.887 |
| 0.7104166666666667 | 7.887 |
| 0.7111111111111111 | 3.525 |
| 0.7118055555555555 | 3.525 |
| 0.7125 | 3.525 |
| 0.7131944444444445 | 3.525 |
| 0.7138888888888889 | 3.525 |
| 0.7145833333333332 | 3.525 |
| 0.7152777777777778 | 3.525 |
| 0.7159722222222222 | 3.525 |
| 0.7166666666666667 | 3.525 |
| 0.717361111111111 | 3.525 |
| 0.7180555555555556 | 3.525 |
| 0.71875 | 0 |
| 0.7194444444444444 | 0 |
| 0.720138888888889 | 0 |
| 0.7208333333333333 | 0 |
| 0.7215277777777778 | 0 |
| 0.7222222222222222 | 0 |
| 0.7229166666666668 | 0 |
| 0.7236111111111111 | 0 |
| 0.7243055555555555 | 0 |
| 0.725 | 0 |
| 0.7256944444444445 | 0 |
| 0.7263888888888889 | 0 |
| 0.7270833333333333 | 0 |
| 0.7277777777777777 | 0 |
| 0.7284722222222223 | 0 |
| 0.7291666666666666 | 0 |
| 0.7298611111111111 | 0 |
| 0.7305555555555556 | 0 |
| 0.7312500000000001 | 0 |
| 0.7319444444444444 | 0 |
| 0.7326388888888888 | 0 |
| 0.7333333333333334 | 0 |
| 0.7340277777777778 | 0 |
| 0.7347222222222222 | 0 |
| 0.7354166666666666 | 0 |
| 0.7361111111111112 | 0 |
| 0.7368055555555556 | 0 |
| 0.7374999999999999 | 0 |
| 0.7381944444444444 | 0 |
| 0.7388888888888889 | 0 |
| 0.7395833333333334 | 0 |
| 0.7402777777777777 | 0 |
| 0.7409722222222223 | 0 |
| 0.7416666666666667 | 0 |
| 0.7423611111111111 | 0 |
| 0.7430555555555555 | 0 |
| 0.74375 | 0 |
| 0.7444444444444445 | 0 |
| 0.7451388888888889 | 0 |
| 0.7458333333333332 | 0 |
| 0.7465277777777778 | 0 |
| 0.7472222222222222 | 0 |
| 0.7479166666666667 | 0 |
| 0.748611111111111 | 0 |
| 0.7493055555555556 | 0 |
| 0.75 | 0 |
| 0.7506944444444444 | 0 |
| 0.751388888888889 | 0 |
| 0.7520833333333333 | 0 |
| 0.7527777777777778 | 0 |
| 0.7534722222222222 | 0 |
| 0.7541666666666668 | 0 |
| 0.7548611111111111 | 0 |
| 0.7555555555555555 | 0 |
| 0.75625 | 0 |
| 0.7569444444444445 | 0 |
| 0.7576388888888889 | 0 |
| 0.7583333333333333 | 0 |
| 0.7590277777777777 | 0 |
| 0.7597222222222223 | 0 |
| 0.7604166666666666 | 0 |
| 0.7611111111111111 | 0 |
| 0.7618055555555556 | 0 |
| 0.7625000000000001 | 0 |
| 0.7631944444444444 | 0 |
| 0.7638888888888888 | 0 |
| 0.7645833333333334 | 0 |
| 0.7652777777777778 | 0 |
| 0.7659722222222222 | 0 |
| 0.7666666666666666 | 0 |
| 0.7673611111111112 | 0 |
| 0.7680555555555556 | 0 |
| 0.7687499999999999 | 0 |
| 0.7694444444444444 | 0 |
| 0.7701388888888889 | 0 |
| 0.7708333333333334 | 0 |
| 0.7715277777777777 | 0 |
| 0.7722222222222223 | 0 |
| 0.7729166666666667 | 0 |
| 0.7736111111111111 | 0 |
| 0.7743055555555555 | 0 |
| 0.775 | 0 |
| 0.7756944444444445 | 0 |
| 0.7763888888888889 | 0 |
| 0.7770833333333332 | 0 |
| 0.7777777777777778 | 0 |
| 0.7784722222222222 | 0 |
| 0.7791666666666667 | 0 |
| 0.779861111111111 | 0 |
| 0.7805555555555556 | 0 |
| 0.78125 | 0 |
| 0.7819444444444444 | 0 |
| 0.782638888888889 | 0 |
| 0.7833333333333333 | 0 |
| 0.7840277777777778 | 0 |
| 0.7847222222222222 | 0 |
| 0.7854166666666668 | 0 |
| 0.7861111111111111 | 0 |
| 0.7868055555555555 | 0 |
| 0.7875 | 0 |
| 0.7881944444444445 | 0 |
| 0.7888888888888889 | 0 |
| 0.7895833333333333 | 0 |
| 0.7902777777777777 | 0 |
| 0.7909722222222223 | 0 |
| 0.7916666666666666 | 0 |
| 0.7923611111111111 | 0 |
| 0.7930555555555556 | 0 |
| 0.7937500000000001 | 0 |
| 0.7944444444444444 | 0 |
| 0.7951388888888888 | 0 |
| 0.7958333333333334 | 0 |
| 0.7965277777777778 | 0 |
| 0.7972222222222222 | 0 |
| 0.7979166666666666 | 0 |
| 0.7986111111111112 | 0 |
| 0.7993055555555556 | 0 |
| 0.7999999999999999 | 0 |
| 0.8006944444444444 | 0 |
| 0.8013888888888889 | 0 |
| 0.8020833333333334 | 0 |
| 0.8027777777777777 | 0 |
| 0.8034722222222223 | 0 |
| 0.8041666666666667 | 0 |
| 0.8048611111111111 | 0 |
| 0.8055555555555555 | 0 |
| 0.80625 | 0 |
| 0.8069444444444445 | 0 |
| 0.8076388888888889 | 0 |
| 0.8083333333333332 | 0 |
| 0.8090277777777778 | 0 |
| 0.8097222222222222 | 0 |
| 0.8104166666666667 | 0 |
| 0.811111111111111 | 0 |
| 0.8118055555555556 | 0 |
| 0.8125 | 0 |
| 0.8131944444444444 | 0 |
| 0.813888888888889 | 0 |
| 0.8145833333333333 | 0 |
| 0.8152777777777778 | 0 |
| 0.8159722222222222 | 0 |
| 0.8166666666666668 | 0 |
| 0.8173611111111111 | 0 |
| 0.8180555555555555 | 0 |
| 0.81875 | 0 |
| 0.8194444444444445 | 0 |
| 0.8201388888888889 | 0 |
| 0.8208333333333333 | 0 |
| 0.8215277777777777 | 0 |
| 0.8222222222222223 | 0 |
| 0.8229166666666666 | 0 |
| 0.8236111111111111 | 0 |
| 0.8243055555555556 | 0 |
| 0.8250000000000001 | 0 |
| 0.8256944444444444 | 0 |
| 0.8263888888888888 | 0 |
| 0.8270833333333334 | 0 |
| 0.8277777777777778 | 0 |
| 0.8284722222222222 | 0 |
| 0.8291666666666666 | 0 |
| 0.8298611111111112 | 0 |
| 0.8305555555555556 | 0 |
| 0.8312499999999999 | 0 |
| 0.8319444444444444 | 0 |
| 0.8326388888888889 | 0 |
| 0.8333333333333334 | 0 |
| 0.8340277777777777 | 0 |
| 0.8347222222222223 | 0 |
| 0.8354166666666667 | 0 |
| 0.8361111111111111 | 0 |
| 0.8368055555555555 | 0 |
| 0.8375 | 0 |
| 0.8381944444444445 | 0 |
| 0.8388888888888889 | 0 |
| 0.8395833333333332 | 0 |
| 0.8402777777777778 | 0 |
| 0.8409722222222222 | 0 |
| 0.8416666666666667 | 0 |
| 0.842361111111111 | 0 |
| 0.8430555555555556 | 0 |
| 0.84375 | 0 |
| 0.8444444444444444 | 0 |
| 0.845138888888889 | 0 |
| 0.8458333333333333 | 0 |
| 0.8465277777777778 | 0 |
| 0.8472222222222222 | 0 |
| 0.8479166666666668 | 0 |
| 0.8486111111111111 | 0 |
| 0.8493055555555555 | 0 |
| 0.85 | 0 |
| 0.8506944444444445 | 0 |
| 0.8513888888888889 | 0 |
| 0.8520833333333333 | 0 |
| 0.8527777777777777 | 0 |
| 0.8534722222222223 | 0 |
| 0.8541666666666666 | 0 |
| 0.8548611111111111 | 0 |
| 0.8555555555555556 | 0 |
| 0.8562500000000001 | 0 |
| 0.8569444444444444 | 0 |
| 0.8576388888888888 | 0 |
| 0.8583333333333334 | 0 |
| 0.8590277777777778 | 0 |
| 0.8597222222222222 | 0 |
| 0.8604166666666666 | 0 |
| 0.8611111111111112 | 0 |
| 0.8618055555555556 | 0 |
| 0.8624999999999999 | 0 |
| 0.8631944444444444 | 0 |
| 0.8638888888888889 | 0 |
| 0.8645833333333334 | 0 |
| 0.8652777777777777 | 0 |
| 0.8659722222222223 | 0 |
| 0.8666666666666667 | 0 |
| 0.8673611111111111 | 0 |
| 0.8680555555555555 | 0 |
| 0.86875 | 0 |
| 0.8694444444444445 | 0 |
| 0.8701388888888889 | 0 |
| 0.8708333333333332 | 0 |
| 0.8715277777777778 | 0 |
| 0.8722222222222222 | 0 |
| 0.8729166666666667 | 0 |
| 0.873611111111111 | 0 |
| 0.8743055555555556 | 0 |
| 0.875 | 0 |
| 0.8756944444444444 | 0 |
| 0.876388888888889 | 0 |
| 0.8770833333333333 | 0 |
| 0.8777777777777778 | 0 |
| 0.8784722222222222 | 0 |
| 0.8791666666666668 | 0 |
| 0.8798611111111111 | 0 |
| 0.8805555555555555 | 0 |
| 0.88125 | 0 |
| 0.8819444444444445 | 0 |
| 0.8826388888888889 | 0 |
| 0.8833333333333333 | 0 |
| 0.8840277777777777 | 0 |
| 0.8847222222222223 | 0 |
| 0.8854166666666666 | 0 |
| 0.8861111111111111 | 0 |
| 0.8868055555555556 | 0 |
| 0.8875000000000001 | 0 |
| 0.8881944444444444 | 0 |
| 0.8888888888888888 | 0 |
| 0.8895833333333334 | 0 |
| 0.8902777777777778 | 0 |
| 0.8909722222222222 | 0 |
| 0.8916666666666666 | 0 |
| 0.8923611111111112 | 0 |
| 0.8930555555555556 | 0 |
| 0.8937499999999999 | 0 |
| 0.8944444444444444 | 0 |
| 0.8951388888888889 | 0 |
| 0.8958333333333334 | 0 |
| 0.8965277777777777 | 0 |
| 0.8972222222222223 | 0 |
| 0.8979166666666667 | 0 |
| 0.8986111111111111 | 0 |
| 0.8993055555555555 | 0 |
| 0.9 | 0 |
| 0.9006944444444445 | 0 |
| 0.9013888888888889 | 0 |
| 0.9020833333333332 | 0 |
| 0.9027777777777778 | 0 |
| 0.9034722222222222 | 0 |
| 0.9041666666666667 | 0 |
| 0.904861111111111 | 0 |
| 0.9055555555555556 | 0 |
| 0.90625 | 0 |
| 0.9069444444444444 | 0 |
| 0.907638888888889 | 0 |
| 0.9083333333333333 | 0 |
| 0.9090277777777778 | 0 |
| 0.9097222222222222 | 0 |
| 0.9104166666666668 | 0 |
| 0.9111111111111111 | 0 |
| 0.9118055555555555 | 0 |
| 0.9125 | 0 |
| 0.9131944444444445 | 0 |
| 0.9138888888888889 | 0 |
| 0.9145833333333333 | 0 |
| 0.9152777777777777 | 0 |
| 0.9159722222222223 | 0 |
| 0.9166666666666666 | 0 |
| 0.9173611111111111 | 0 |
| 0.9180555555555556 | 0 |
| 0.9187500000000001 | 0 |
| 0.9194444444444444 | 0 |
| 0.9201388888888888 | 0 |
| 0.9208333333333334 | 0 |
| 0.9215277777777778 | 0 |
| 0.9222222222222222 | 0 |
| 0.9229166666666666 | 0 |
| 0.9236111111111112 | 0 |
| 0.9243055555555556 | 0 |
| 0.9249999999999999 | 0 |
| 0.9256944444444444 | 0 |
| 0.9263888888888889 | 0 |
| 0.9270833333333334 | 0 |
| 0.9277777777777777 | 0 |
| 0.9284722222222223 | 0 |
| 0.9291666666666667 | 0 |
| 0.9298611111111111 | 0 |
| 0.9305555555555555 | 0 |
| 0.93125 | 0 |
| 0.9319444444444445 | 0 |
| 0.9326388888888889 | 0 |
| 0.9333333333333332 | 0 |
| 0.9340277777777778 | 0 |
| 0.9347222222222222 | 0 |
| 0.9354166666666667 | 0 |
| 0.936111111111111 | 0 |
| 0.9368055555555556 | 0 |
| 0.9375 | 0 |
| 0.9381944444444444 | 0 |
| 0.938888888888889 | 0 |
| 0.9395833333333333 | 0 |
| 0.9402777777777778 | 0 |
| 0.9409722222222222 | 0 |
| 0.9416666666666668 | 0 |
| 0.9423611111111111 | 0 |
| 0.9430555555555555 | 0 |
| 0.94375 | 0 |
| 0.9444444444444445 | 0 |
| 0.9451388888888889 | 0 |
| 0.9458333333333333 | 0 |
| 0.9465277777777777 | 0 |
| 0.9472222222222223 | 0 |
| 0.9479166666666666 | 0 |
| 0.9486111111111111 | 0 |
| 0.9493055555555556 | 0 |
| 0.9500000000000001 | 0 |
| 0.9506944444444444 | 0 |
| 0.9513888888888888 | 0 |
| 0.9520833333333334 | 0 |
| 0.9527777777777778 | 0 |
| 0.9534722222222222 | 0 |
| 0.9541666666666666 | 0 |
| 0.9548611111111112 | 0 |
| 0.9555555555555556 | 0 |
| 0.9562499999999999 | 0 |
| 0.9569444444444444 | 0 |
| 0.9576388888888889 | 0 |
| 0.9583333333333334 | 0 |
| 0.9590277777777777 | 0 |
| 0.9597222222222223 | 0 |
| 0.9604166666666667 | 0 |
| 0.9611111111111111 | 0 |
| 0.9618055555555555 | 0 |
| 0.9625 | 0 |
| 0.9631944444444445 | 0 |
| 0.9638888888888889 | 0 |
| 0.9645833333333332 | 0 |
| 0.9652777777777778 | 0 |
| 0.9659722222222222 | 0 |
| 0.9666666666666667 | 0 |
| 0.967361111111111 | 0 |
| 0.9680555555555556 | 0 |
| 0.96875 | 0 |
| 0.9694444444444444 | 0 |
| 0.970138888888889 | 0 |
| 0.9708333333333333 | 0 |
| 0.9715277777777778 | 0 |
| 0.9722222222222222 | 0 |
| 0.9729166666666668 | 0 |
| 0.9736111111111111 | 0 |
| 0.9743055555555555 | 0 |
| 0.975 | 0 |
| 0.9756944444444445 | 0 |
| 0.9763888888888889 | 0 |
| 0.9770833333333333 | 0 |
| 0.9777777777777777 | 0 |
| 0.9784722222222223 | 0 |
| 0.9791666666666666 | 0 |
| 0.9798611111111111 | 0 |
| 0.9805555555555556 | 0 |
| 0.9812500000000001 | 0 |
| 0.9819444444444444 | 0 |
| 0.9826388888888888 | 0 |
| 0.9833333333333334 | 0 |
| 0.9840277777777778 | 0 |
| 0.9847222222222222 | 0 |
| 0.9854166666666666 | 0 |
| 0.9861111111111112 | 0 |
| 0.9868055555555556 | 0 |
| 0.9874999999999999 | 0 |
| 0.9881944444444444 | 0 |
| 0.9888888888888889 | 0 |
| 0.9895833333333334 | 0 |
| 0.9902777777777777 | 0 |
| 0.9909722222222223 | 0 |
| 0.9916666666666667 | 0 |
| 0.9923611111111111 | 0 |
| 0.9930555555555555 | 0 |
| 0.99375 | 0 |
| 0.9944444444444445 | 0 |
| 0.9951388888888889 | 0 |
| 0.9958333333333332 | 0 |
| 0.9965277777777778 | 0 |
| 0.9972222222222222 | 0 |
| 0.9979166666666667 | 0 |
| 0.998611111111111 | 0 |
| 0.9993055555555556 | 0 |